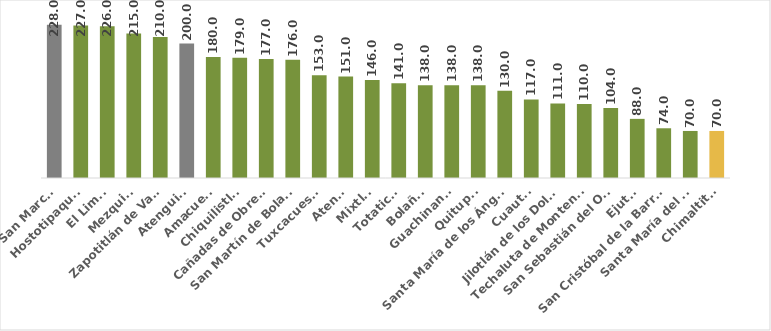
| Category | Series 0 |
|---|---|
| San Marcos | 228 |
| Hostotipaquillo | 227 |
| El Limón | 226 |
| Mezquitic | 215 |
| Zapotitlán de Vadillo | 210 |
| Atenguillo | 200 |
| Amacueca | 180 |
| Chiquilistlán | 179 |
| Cañadas de Obregón | 177 |
| San Martín de Bolaños | 176 |
| Tuxcacuesco | 153 |
| Atengo | 151 |
| Mixtlán | 146 |
| Totatiche | 141 |
| Bolaños | 138 |
| Guachinango | 138 |
| Quitupan | 138 |
| Santa María de los Ángeles | 130 |
| Cuautla | 117 |
| Jilotlán de los Dolores | 111 |
| Techaluta de Montenegro | 110 |
| San Sebastián del Oeste | 104 |
| Ejutla | 88 |
| San Cristóbal de la Barranca | 74 |
| Santa María del Oro | 70 |
| Chimaltitán | 70 |